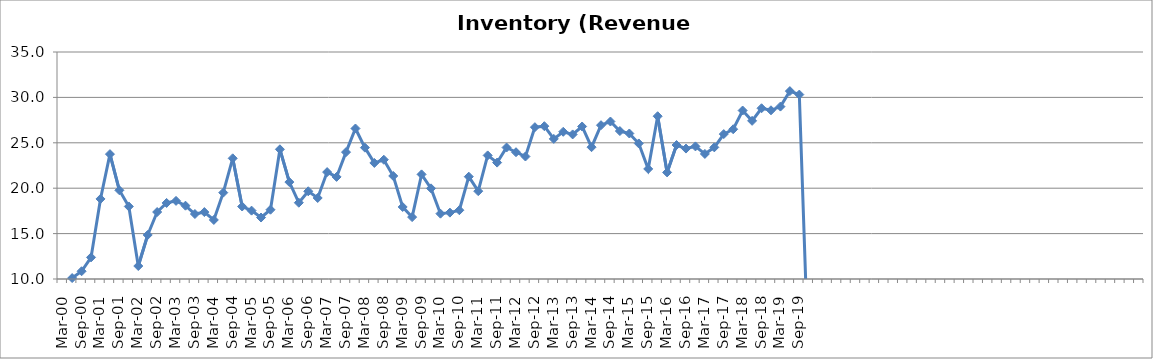
| Category | Inventory (Revenue Days) |
|---|---|
| Mar-00 | 9.555 |
| Jun-00 | 10.105 |
| Sep-00 | 10.854 |
| Dec-00 | 12.382 |
| Mar-01 | 18.818 |
| Jun-01 | 23.752 |
| Sep-01 | 19.77 |
| Dec-01 | 17.989 |
| Mar-02 | 11.43 |
| Jun-02 | 14.849 |
| Sep-02 | 17.377 |
| Dec-02 | 18.375 |
| Mar-03 | 18.603 |
| Jun-03 | 18.072 |
| Sep-03 | 17.157 |
| Dec-03 | 17.37 |
| Mar-04 | 16.503 |
| Jun-04 | 19.51 |
| Sep-04 | 23.29 |
| Dec-04 | 17.983 |
| Mar-05 | 17.529 |
| Jun-05 | 16.77 |
| Sep-05 | 17.63 |
| Dec-05 | 24.283 |
| Mar-06 | 20.675 |
| Jun-06 | 18.402 |
| Sep-06 | 19.662 |
| Dec-06 | 18.922 |
| Mar-07 | 21.773 |
| Jun-07 | 21.243 |
| Sep-07 | 23.972 |
| Dec-07 | 26.573 |
| Mar-08 | 24.465 |
| Jun-08 | 22.781 |
| Sep-08 | 23.135 |
| Dec-08 | 21.345 |
| Mar-09 | 17.932 |
| Jun-09 | 16.815 |
| Sep-09 | 21.522 |
| Dec-09 | 19.982 |
| Mar-10 | 17.193 |
| Jun-10 | 17.308 |
| Sep-10 | 17.574 |
| Dec-10 | 21.27 |
| Mar-11 | 19.674 |
| Jun-11 | 23.61 |
| Sep-11 | 22.82 |
| Dec-11 | 24.48 |
| Mar-12 | 23.962 |
| Jun-12 | 23.49 |
| Sep-12 | 26.72 |
| Dec-12 | 26.83 |
| Mar-13 | 25.429 |
| Jun-13 | 26.213 |
| Sep-13 | 25.921 |
| Dec-13 | 26.796 |
| Mar-14 | 24.516 |
| Jun-14 | 26.938 |
| Sep-14 | 27.344 |
| Dec-14 | 26.293 |
| Mar-15 | 26.025 |
| Jun-15 | 24.928 |
| Sep-15 | 22.12 |
| Dec-15 | 27.926 |
| Mar-16 | 21.74 |
| Jun-16 | 24.755 |
| Sep-16 | 24.365 |
| Dec-16 | 24.604 |
| Mar-17 | 23.774 |
| Jun-17 | 24.499 |
| Sep-17 | 25.96 |
| Dec-17 | 26.493 |
| Mar-18 | 28.555 |
| Jun-18 | 27.418 |
| Sep-18 | 28.805 |
| Dec-18 | 28.581 |
| Mar-19 | 28.988 |
| Jun-19 | 30.692 |
| Sep-19 | 30.311 |